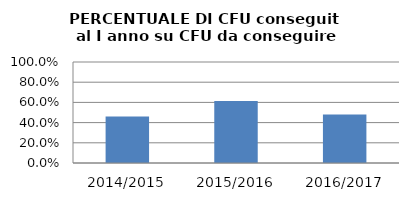
| Category | 2014/2015 2015/2016 2016/2017 |
|---|---|
| 2014/2015 | 0.459 |
| 2015/2016 | 0.614 |
| 2016/2017 | 0.479 |